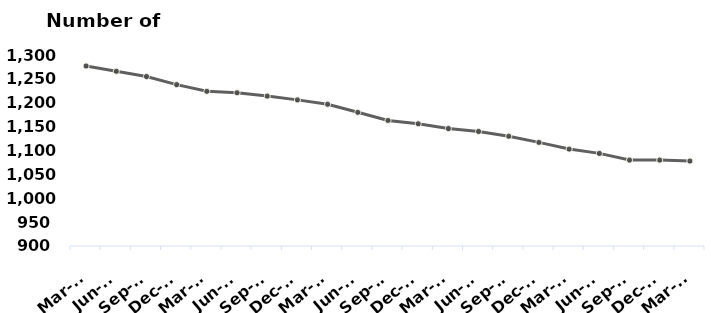
| Category | Total |
|---|---|
| Mar-15 | 1277 |
| Jun-15 | 1266 |
| Sep-15 | 1255 |
| Dec-15 | 1238 |
| Mar-16 | 1224 |
| Jun-16 | 1221 |
| Sep-16 | 1214 |
| Dec-16 | 1206 |
| Mar-17 | 1197 |
| Jun-17 | 1180 |
| Sep-17 | 1163 |
| Dec-17 | 1156 |
| Mar-18 | 1146 |
| Jun-18 | 1140 |
| Sep-18 | 1130 |
| Dec-18 | 1117 |
| Mar-19 | 1103 |
| Jun-19 | 1094 |
| Sep-19 | 1080 |
| Dec-19 | 1080 |
| Mar-20 | 1078 |